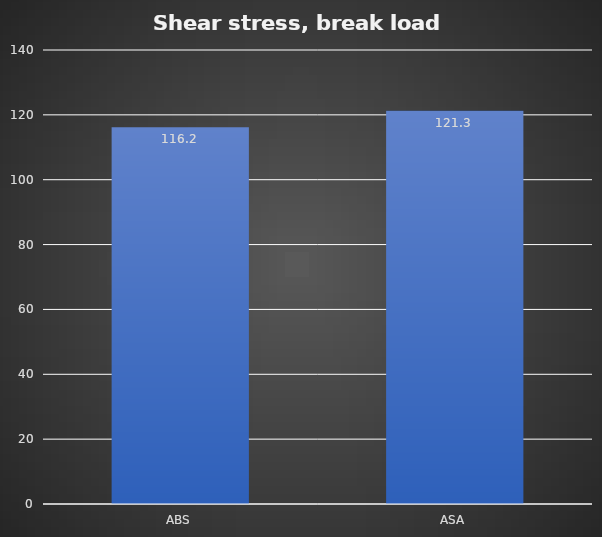
| Category | Break kg |
|---|---|
| ABS | 116.2 |
| ASA | 121.3 |